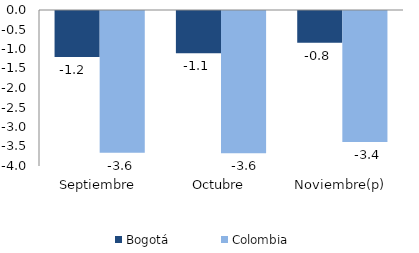
| Category | Bogotá | Colombia |
|---|---|---|
| Septiembre | -1.179 | -3.637 |
| Octubre | -1.082 | -3.648 |
| Noviembre(p) | -0.816 | -3.36 |